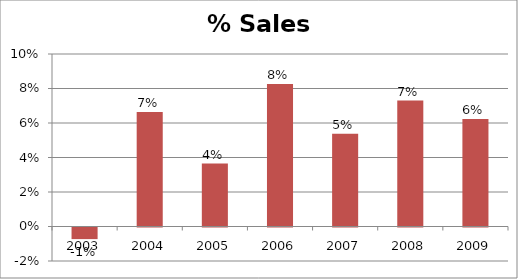
| Category | % Sales Growth |
|---|---|
| 2003.0 | -0.007 |
| 2004.0 | 0.066 |
| 2005.0 | 0.036 |
| 2006.0 | 0.083 |
| 2007.0 | 0.054 |
| 2008.0 | 0.073 |
| 2009.0 | 0.062 |